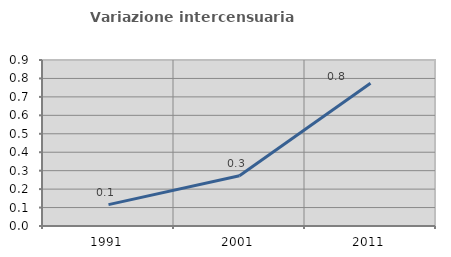
| Category | Variazione intercensuaria annua |
|---|---|
| 1991.0 | 0.116 |
| 2001.0 | 0.272 |
| 2011.0 | 0.774 |